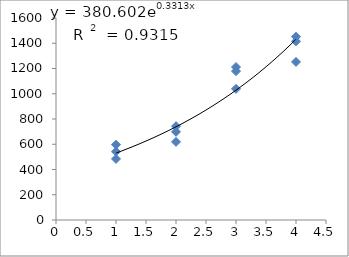
| Category | Series 0 |
|---|---|
| 1.0 | 483.681 |
| 1.0 | 596.221 |
| 1.0 | 541.148 |
| 2.0 | 742.702 |
| 2.0 | 698.493 |
| 2.0 | 618.918 |
| 3.0 | 1038.701 |
| 3.0 | 1211.817 |
| 3.0 | 1179.066 |
| 4.0 | 1252.048 |
| 4.0 | 1451.65 |
| 4.0 | 1415.359 |